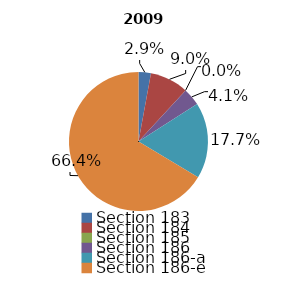
| Category | 2009 |
|---|---|
| Section 183 | 19286968 |
| Section 184 | 60082900 |
| Section 185 | 24505 |
| Section 186 | 27551541 |
| Section 186-a | 118410258 |
| Section 186-e | 444713657 |